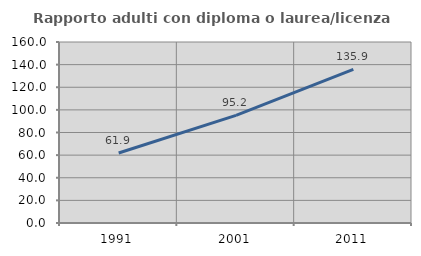
| Category | Rapporto adulti con diploma o laurea/licenza media  |
|---|---|
| 1991.0 | 61.853 |
| 2001.0 | 95.15 |
| 2011.0 | 135.867 |